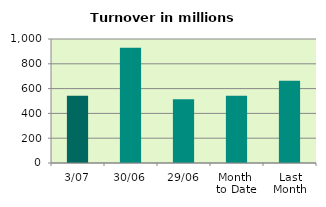
| Category | Series 0 |
|---|---|
| 3/07 | 542.208 |
| 30/06 | 930.062 |
| 29/06 | 513.268 |
| Month 
to Date | 542.208 |
| Last
Month | 663.186 |